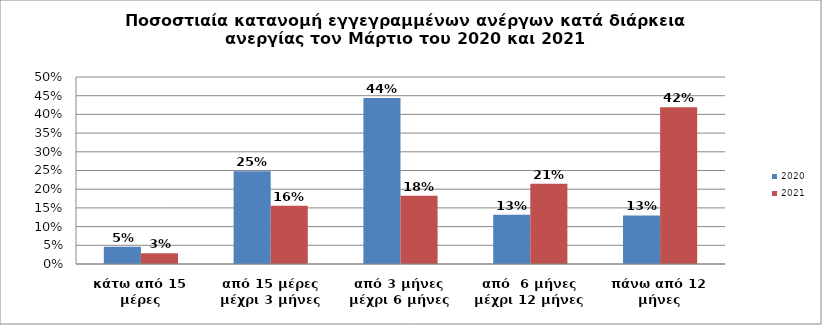
| Category | 2020 | 2021 |
|---|---|---|
| κάτω από 15 μέρες | 0.046 | 0.029 |
| από 15 μέρες μέχρι 3 μήνες | 0.248 | 0.156 |
| από 3 μήνες μέχρι 6 μήνες | 0.444 | 0.182 |
| από  6 μήνες μέχρι 12 μήνες | 0.132 | 0.214 |
| πάνω από 12 μήνες | 0.13 | 0.419 |